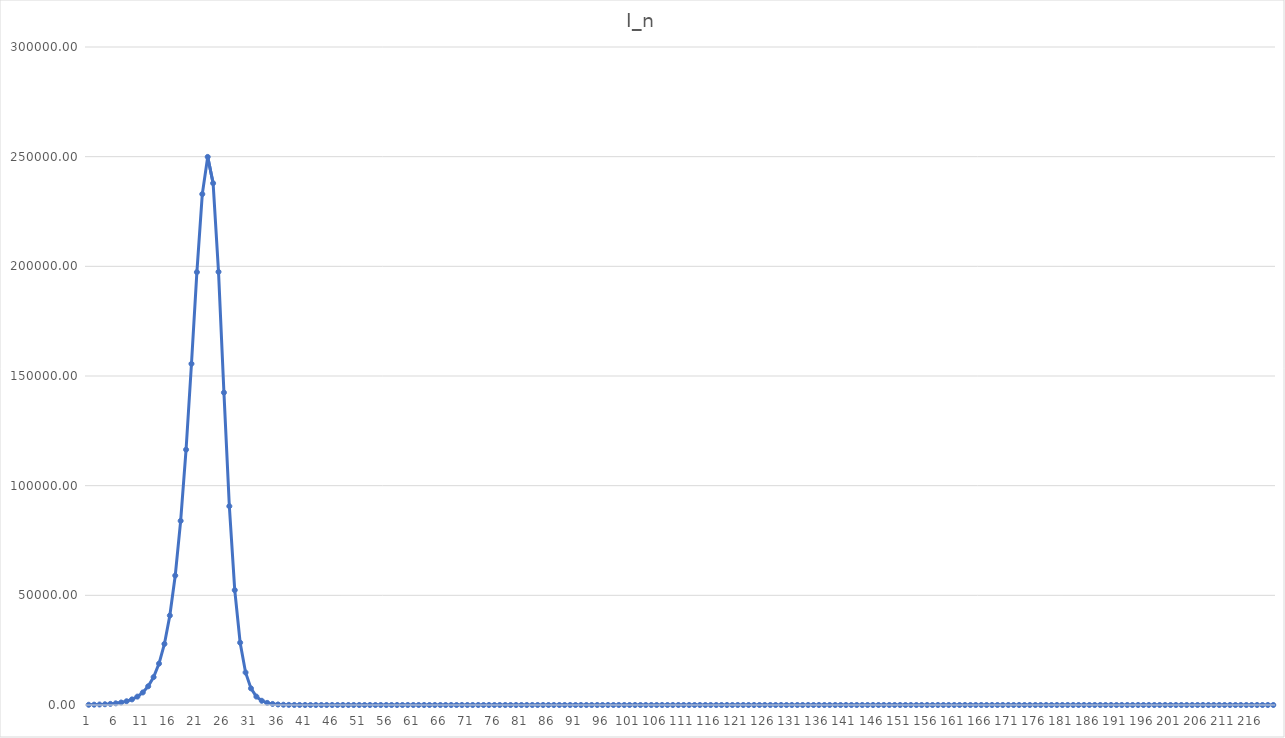
| Category | I_n |
|---|---|
| 0 | 100 |
| 1 | 149.998 |
| 2 | 224.983 |
| 3 | 337.434 |
| 4 | 506.042 |
| 5 | 758.794 |
| 6 | 1137.547 |
| 7 | 1704.815 |
| 8 | 2553.755 |
| 9 | 3822.721 |
| 10 | 5716.144 |
| 11 | 8533.762 |
| 12 | 12709.848 |
| 13 | 18862.044 |
| 14 | 27843.329 |
| 15 | 40776.005 |
| 16 | 59016.148 |
| 17 | 83943.232 |
| 18 | 116398.834 |
| 19 | 155573.094 |
| 20 | 197353.65 |
| 21 | 232941.905 |
| 22 | 249889.229 |
| 23 | 237905.954 |
| 24 | 197484.984 |
| 25 | 142435.871 |
| 26 | 90627.516 |
| 27 | 52382.982 |
| 28 | 28404.695 |
| 29 | 14828.771 |
| 30 | 7581.137 |
| 31 | 3833.346 |
| 32 | 1927.365 |
| 33 | 966.282 |
| 34 | 483.745 |
| 35 | 242 |
| 36 | 121.02 |
| 37 | 60.509 |
| 38 | 30.251 |
| 39 | 15.123 |
| 40 | 7.56 |
| 41 | 3.779 |
| 42 | 1.889 |
| 43 | 0.944 |
| 44 | 0.472 |
| 45 | 0.236 |
| 46 | 0.118 |
| 47 | 0.059 |
| 48 | 0.029 |
| 49 | 0.015 |
| 50 | 0.007 |
| 51 | 0.004 |
| 52 | 0.002 |
| 53 | 0.001 |
| 54 | 0 |
| 55 | 0 |
| 56 | 0 |
| 57 | 0 |
| 58 | 0 |
| 59 | 0 |
| 60 | 0 |
| 61 | 0 |
| 62 | 0 |
| 63 | 0 |
| 64 | 0 |
| 65 | 0 |
| 66 | 0 |
| 67 | 0 |
| 68 | 0 |
| 69 | 0 |
| 70 | 0 |
| 71 | 0 |
| 72 | 0 |
| 73 | 0 |
| 74 | 0 |
| 75 | 0 |
| 76 | 0 |
| 77 | 0 |
| 78 | 0 |
| 79 | 0 |
| 80 | 0 |
| 81 | 0 |
| 82 | 0 |
| 83 | 0 |
| 84 | 0 |
| 85 | 0 |
| 86 | 0 |
| 87 | 0 |
| 88 | 0 |
| 89 | 0 |
| 90 | 0 |
| 91 | 0 |
| 92 | 0 |
| 93 | 0 |
| 94 | 0 |
| 95 | 0 |
| 96 | 0 |
| 97 | 0 |
| 98 | 0 |
| 99 | 0 |
| 100 | 0 |
| 101 | 0 |
| 102 | 0 |
| 103 | 0 |
| 104 | 0 |
| 105 | 0 |
| 106 | 0 |
| 107 | 0 |
| 108 | 0 |
| 109 | 0 |
| 110 | 0 |
| 111 | 0 |
| 112 | 0 |
| 113 | 0 |
| 114 | 0 |
| 115 | 0 |
| 116 | 0 |
| 117 | 0 |
| 118 | 0 |
| 119 | 0 |
| 120 | 0 |
| 121 | 0 |
| 122 | 0 |
| 123 | 0 |
| 124 | 0 |
| 125 | 0 |
| 126 | 0 |
| 127 | 0 |
| 128 | 0 |
| 129 | 0 |
| 130 | 0 |
| 131 | 0 |
| 132 | 0 |
| 133 | 0 |
| 134 | 0 |
| 135 | 0 |
| 136 | 0 |
| 137 | 0 |
| 138 | 0 |
| 139 | 0 |
| 140 | 0 |
| 141 | 0 |
| 142 | 0 |
| 143 | 0 |
| 144 | 0 |
| 145 | 0 |
| 146 | 0 |
| 147 | 0 |
| 148 | 0 |
| 149 | 0 |
| 150 | 0 |
| 151 | 0 |
| 152 | 0 |
| 153 | 0 |
| 154 | 0 |
| 155 | 0 |
| 156 | 0 |
| 157 | 0 |
| 158 | 0 |
| 159 | 0 |
| 160 | 0 |
| 161 | 0 |
| 162 | 0 |
| 163 | 0 |
| 164 | 0 |
| 165 | 0 |
| 166 | 0 |
| 167 | 0 |
| 168 | 0 |
| 169 | 0 |
| 170 | 0 |
| 171 | 0 |
| 172 | 0 |
| 173 | 0 |
| 174 | 0 |
| 175 | 0 |
| 176 | 0 |
| 177 | 0 |
| 178 | 0 |
| 179 | 0 |
| 180 | 0 |
| 181 | 0 |
| 182 | 0 |
| 183 | 0 |
| 184 | 0 |
| 185 | 0 |
| 186 | 0 |
| 187 | 0 |
| 188 | 0 |
| 189 | 0 |
| 190 | 0 |
| 191 | 0 |
| 192 | 0 |
| 193 | 0 |
| 194 | 0 |
| 195 | 0 |
| 196 | 0 |
| 197 | 0 |
| 198 | 0 |
| 199 | 0 |
| 200 | 0 |
| 201 | 0 |
| 202 | 0 |
| 203 | 0 |
| 204 | 0 |
| 205 | 0 |
| 206 | 0 |
| 207 | 0 |
| 208 | 0 |
| 209 | 0 |
| 210 | 0 |
| 211 | 0 |
| 212 | 0 |
| 213 | 0 |
| 214 | 0 |
| 215 | 0 |
| 216 | 0 |
| 217 | 0 |
| 218 | 0 |
| 219 | 0 |